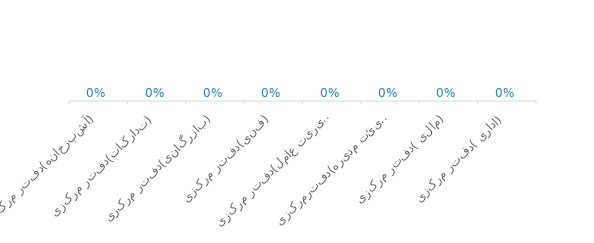
| Category | Series 0 |
|---|---|
| آشپزخانه(دفتر مرکزی) | 0 |
| تدارکات(دفتر مرکزی) | 0 |
| بازرگانی(دفتر مرکزی) | 0 |
| فنی(دفتر مرکزی) | 0 |
| مدیریت عامل(دفتر مرکزی) | 0 |
| هیئت مدیره(دفترمرکزی) | 0 |
| مالی (دفتر مرکزی) | 0 |
| اداری (دفتر مرکزی) | 0 |